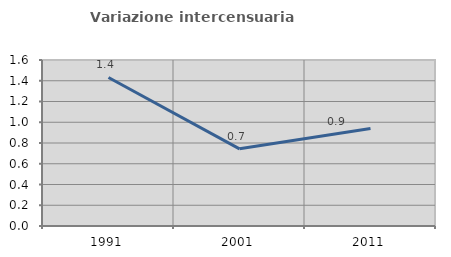
| Category | Variazione intercensuaria annua |
|---|---|
| 1991.0 | 1.432 |
| 2001.0 | 0.744 |
| 2011.0 | 0.939 |